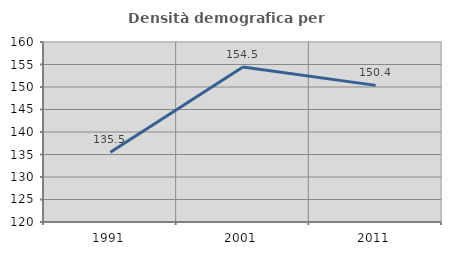
| Category | Densità demografica |
|---|---|
| 1991.0 | 135.494 |
| 2001.0 | 154.452 |
| 2011.0 | 150.363 |